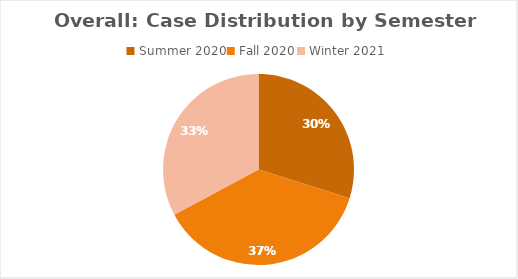
| Category | Series 0 |
|---|---|
| Summer 2020 | 100 |
| Fall 2020 | 125 |
| Winter 2021 | 110 |